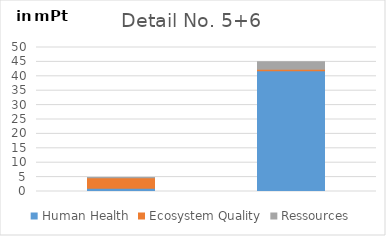
| Category | Human Health | Ecosystem Quality | Ressources |
|---|---|---|---|
| mPt | 1.17 | 3.58 | 0.115 |
| mPt | 41.9 | 0.521 | 2.61 |